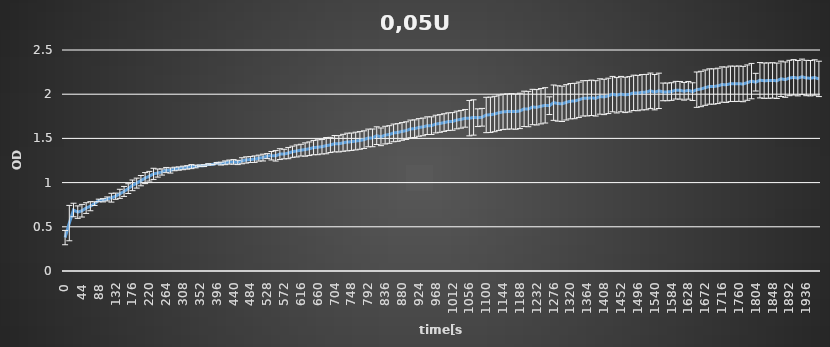
| Category | 0,05U |
|---|---|
| 0.0 | 0.378 |
| 11.0 | 0.542 |
| 22.0 | 0.69 |
| 33.0 | 0.666 |
| 44.0 | 0.682 |
| 55.0 | 0.712 |
| 66.0 | 0.733 |
| 77.0 | 0.762 |
| 88.0 | 0.798 |
| 99.0 | 0.8 |
| 110.0 | 0.815 |
| 121.0 | 0.829 |
| 132.0 | 0.846 |
| 143.0 | 0.873 |
| 154.0 | 0.9 |
| 165.0 | 0.932 |
| 176.0 | 0.969 |
| 187.0 | 0.994 |
| 198.0 | 1.022 |
| 209.0 | 1.051 |
| 220.0 | 1.072 |
| 231.0 | 1.099 |
| 242.0 | 1.108 |
| 253.0 | 1.12 |
| 264.0 | 1.142 |
| 275.0 | 1.137 |
| 286.0 | 1.154 |
| 297.0 | 1.159 |
| 308.0 | 1.166 |
| 319.0 | 1.172 |
| 330.0 | 1.181 |
| 341.0 | 1.182 |
| 352.0 | 1.19 |
| 363.0 | 1.192 |
| 374.0 | 1.206 |
| 385.0 | 1.204 |
| 396.0 | 1.22 |
| 407.0 | 1.215 |
| 418.0 | 1.224 |
| 429.0 | 1.232 |
| 440.0 | 1.234 |
| 451.0 | 1.228 |
| 462.0 | 1.247 |
| 473.0 | 1.256 |
| 484.0 | 1.261 |
| 495.0 | 1.265 |
| 506.0 | 1.277 |
| 517.0 | 1.283 |
| 528.0 | 1.3 |
| 539.0 | 1.304 |
| 550.0 | 1.303 |
| 561.0 | 1.322 |
| 572.0 | 1.323 |
| 583.0 | 1.334 |
| 594.0 | 1.349 |
| 605.0 | 1.358 |
| 616.0 | 1.367 |
| 627.0 | 1.374 |
| 638.0 | 1.383 |
| 649.0 | 1.396 |
| 660.0 | 1.4 |
| 671.0 | 1.406 |
| 682.0 | 1.418 |
| 693.0 | 1.426 |
| 704.0 | 1.44 |
| 715.0 | 1.439 |
| 726.0 | 1.45 |
| 737.0 | 1.459 |
| 748.0 | 1.462 |
| 759.0 | 1.47 |
| 770.0 | 1.477 |
| 781.0 | 1.486 |
| 792.0 | 1.505 |
| 803.0 | 1.506 |
| 814.0 | 1.531 |
| 825.0 | 1.518 |
| 836.0 | 1.537 |
| 847.0 | 1.544 |
| 858.0 | 1.562 |
| 869.0 | 1.567 |
| 880.0 | 1.579 |
| 891.0 | 1.588 |
| 902.0 | 1.607 |
| 913.0 | 1.61 |
| 924.0 | 1.624 |
| 935.0 | 1.63 |
| 946.0 | 1.644 |
| 957.0 | 1.644 |
| 968.0 | 1.662 |
| 979.0 | 1.669 |
| 990.0 | 1.679 |
| 1001.0 | 1.689 |
| 1012.0 | 1.692 |
| 1023.0 | 1.708 |
| 1034.0 | 1.716 |
| 1045.0 | 1.727 |
| 1056.0 | 1.729 |
| 1067.0 | 1.737 |
| 1078.0 | 1.734 |
| 1089.0 | 1.739 |
| 1100.0 | 1.765 |
| 1111.0 | 1.767 |
| 1122.0 | 1.776 |
| 1133.0 | 1.79 |
| 1144.0 | 1.8 |
| 1155.0 | 1.804 |
| 1166.0 | 1.806 |
| 1177.0 | 1.803 |
| 1188.0 | 1.811 |
| 1199.0 | 1.834 |
| 1210.0 | 1.832 |
| 1221.0 | 1.855 |
| 1232.0 | 1.852 |
| 1243.0 | 1.864 |
| 1254.0 | 1.874 |
| 1265.0 | 1.87 |
| 1276.0 | 1.904 |
| 1287.0 | 1.895 |
| 1298.0 | 1.891 |
| 1309.0 | 1.908 |
| 1320.0 | 1.921 |
| 1331.0 | 1.923 |
| 1342.0 | 1.937 |
| 1353.0 | 1.953 |
| 1364.0 | 1.954 |
| 1375.0 | 1.959 |
| 1386.0 | 1.953 |
| 1397.0 | 1.974 |
| 1408.0 | 1.969 |
| 1419.0 | 1.981 |
| 1430.0 | 2.001 |
| 1441.0 | 1.988 |
| 1452.0 | 2.001 |
| 1463.0 | 1.992 |
| 1474.0 | 1.999 |
| 1485.0 | 2.015 |
| 1496.0 | 2.013 |
| 1507.0 | 2.022 |
| 1518.0 | 2.024 |
| 1529.0 | 2.039 |
| 1540.0 | 2.023 |
| 1551.0 | 2.038 |
| 1562.0 | 2.026 |
| 1573.0 | 2.026 |
| 1584.0 | 2.03 |
| 1595.0 | 2.045 |
| 1606.0 | 2.044 |
| 1617.0 | 2.033 |
| 1628.0 | 2.044 |
| 1639.0 | 2.029 |
| 1650.0 | 2.051 |
| 1661.0 | 2.059 |
| 1672.0 | 2.074 |
| 1683.0 | 2.087 |
| 1694.0 | 2.087 |
| 1705.0 | 2.094 |
| 1716.0 | 2.109 |
| 1727.0 | 2.107 |
| 1738.0 | 2.118 |
| 1749.0 | 2.117 |
| 1760.0 | 2.119 |
| 1771.0 | 2.115 |
| 1782.0 | 2.131 |
| 1793.0 | 2.148 |
| 1804.0 | 2.136 |
| 1815.0 | 2.158 |
| 1826.0 | 2.153 |
| 1837.0 | 2.154 |
| 1848.0 | 2.156 |
| 1859.0 | 2.152 |
| 1870.0 | 2.174 |
| 1881.0 | 2.165 |
| 1892.0 | 2.183 |
| 1903.0 | 2.191 |
| 1914.0 | 2.181 |
| 1925.0 | 2.197 |
| 1936.0 | 2.183 |
| 1947.0 | 2.181 |
| 1958.0 | 2.189 |
| 1969.0 | 2.173 |